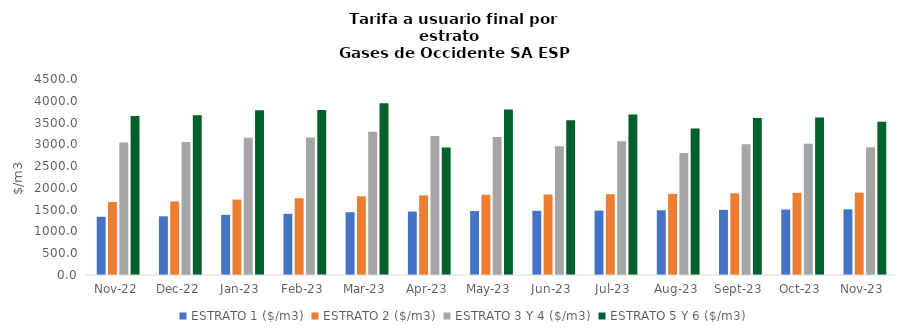
| Category | ESTRATO 1 ($/m3) | ESTRATO 2 ($/m3) | ESTRATO 3 Y 4 ($/m3) | ESTRATO 5 Y 6 ($/m3) |
|---|---|---|---|---|
| 2022-11-01 | 1337.14 | 1675.76 | 3041.35 | 3649.62 |
| 2022-12-01 | 1347.43 | 1688.66 | 3054.71 | 3665.652 |
| 2023-01-01 | 1380.44 | 1732.41 | 3153.94 | 3784.728 |
| 2023-02-01 | 1405.01 | 1763.25 | 3155.49 | 3786.588 |
| 2023-03-01 | 1440.79 | 1807.57 | 3288.4 | 3946.08 |
| 2023-04-01 | 1455.91 | 1826.55 | 3194.1 | 2929.63 |
| 2023-05-01 | 1467.27 | 1840.8 | 3166.38 | 3799.656 |
| 2023-06-01 | 1473.58 | 1848.72 | 2958.7 | 3550.44 |
| 2023-07-01 | 1478 | 1854.26 | 3071.96 | 3686.352 |
| 2023-08-01 | 1485.39 | 1863.53 | 2800.92 | 3361.104 |
| 2023-09-01 | 1495.79 | 1876.58 | 3003.77 | 3604.524 |
| 2023-10-01 | 1503.86 | 1886.71 | 3011.88 | 3614.256 |
| 2023-11-01 | 1507.62 | 1891.43 | 2933.28 | 3519.936 |